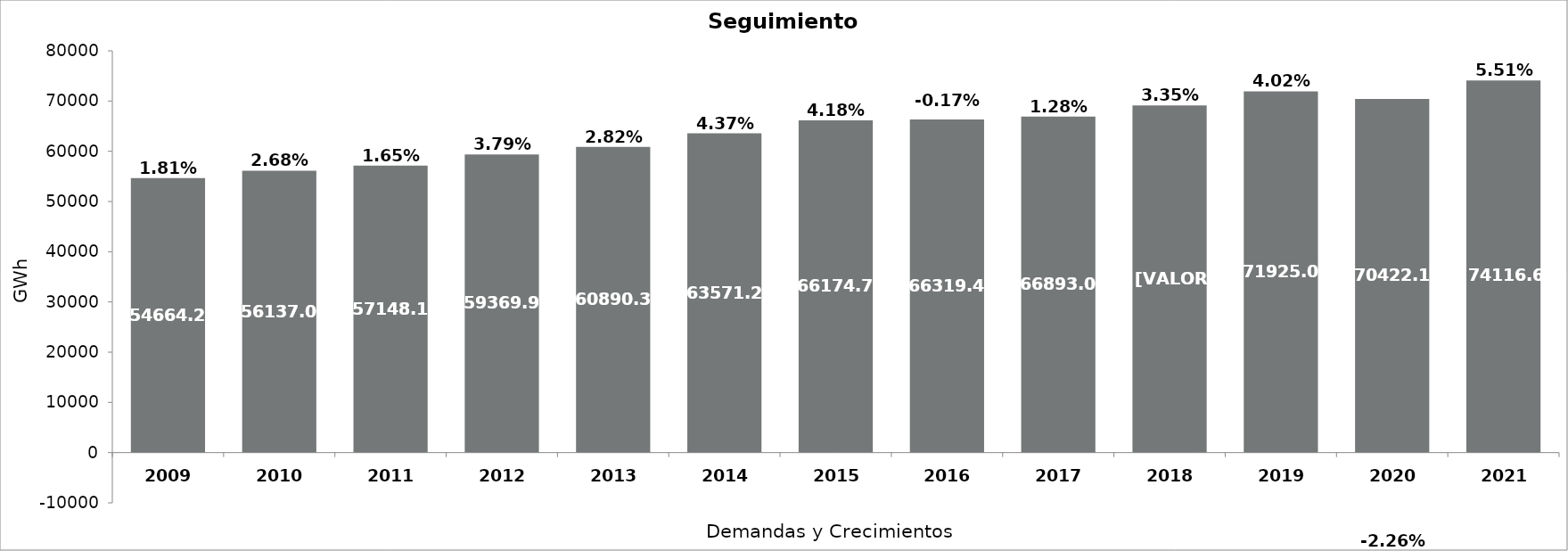
| Category | Demanda GWh |   |
|---|---|---|
| 2009.0 | 54664.213 | 0.018 |
| 2010.0 | 56137.031 | 0.027 |
| 2011.0 | 57148.181 | 0.016 |
| 2012.0 | 59369.895 | 0.038 |
| 2013.0 | 60890.316 | 0.028 |
| 2014.0 | 63571.227 | 0.044 |
| 2015.0 | 66174.749 | 0.042 |
| 2016.0 | 66319.48 | -0.002 |
| 2017.0 | 66893.037 | 0.013 |
| 2018.0 | 69126.732 | 0.034 |
| 2019.0 | 71925.021 | 0.04 |
| 2020.0 | 70422.134 | -0.023 |
| 2021.0 | 74116.614 | 0.055 |